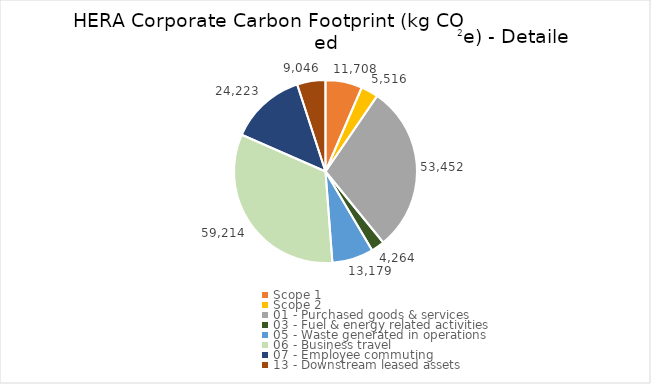
| Category | Series 0 |
|---|---|
| Scope 1 | 11708.051 |
| Scope 2 | 5515.703 |
| 01 - Purchased goods & services | 53451.912 |
| 03 - Fuel & energy related activities | 4263.578 |
| 05 - Waste generated in operations | 13179.499 |
| 06 - Business travel | 59214.421 |
| 07 - Employee commuting | 24223.328 |
| 13 - Downstream leased assets | 9046.075 |